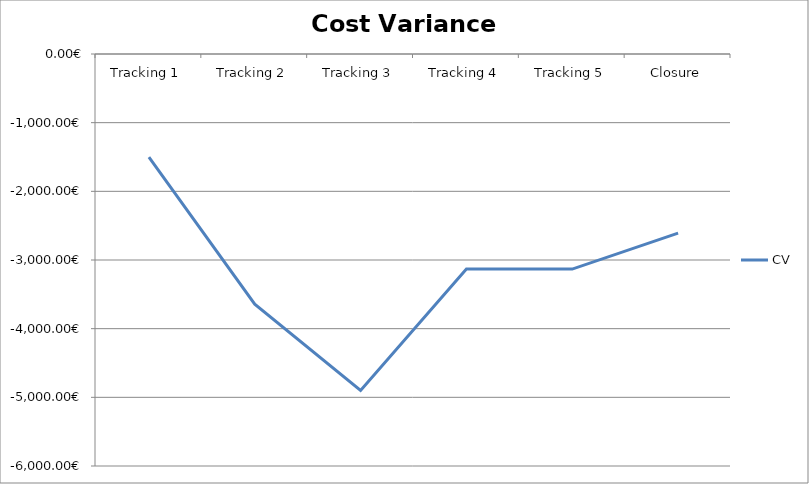
| Category | CV |
|---|---|
| Tracking 1 | -1503.129 |
| Tracking 2 | -3643.775 |
| Tracking 3 | -4900.249 |
| Tracking 4 | -3131.52 |
| Tracking 5 | -3132.092 |
| Closure | -2609.6 |